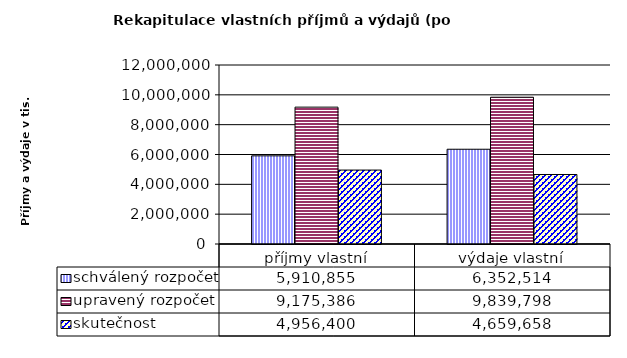
| Category | schválený rozpočet | upravený rozpočet | skutečnost |
|---|---|---|---|
| příjmy vlastní | 5910855 | 9175386 | 4956400 |
| výdaje vlastní | 6352514 | 9839798 | 4659658 |